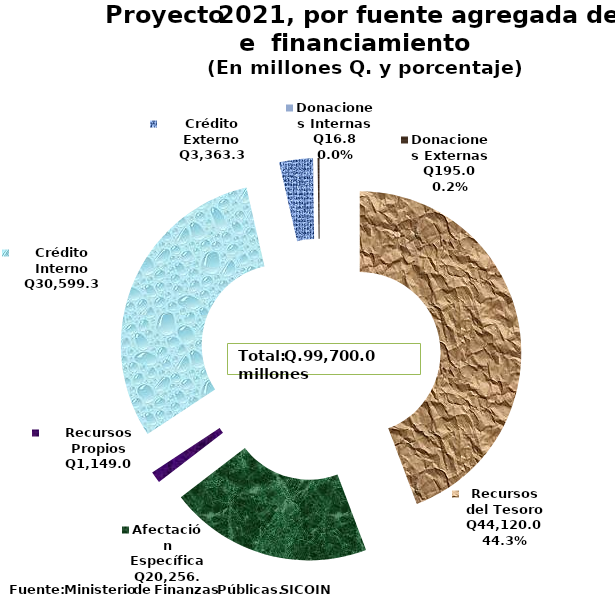
| Category | Recomendado 2018 |
|---|---|
| Recursos del Tesoro | 44120 |
| Afectación Específica | 20256.6 |
| Recursos Propios | 1149 |
| Crédito Interno | 30599.3 |
| Crédito Externo | 3363.3 |
| Donaciones Externas | 195 |
| Donaciones Internas | 16.8 |